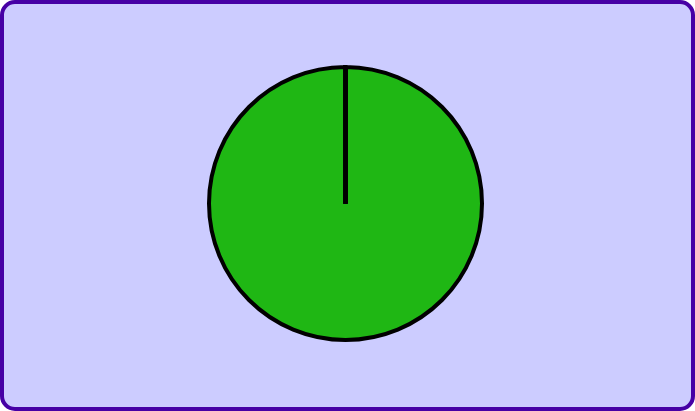
| Category | Series 0 |
|---|---|
| 0 | 1 |
| 1 | 0 |
| 2 | 0 |
| 3 | 0 |
| 4 | 0 |
| 5 | 0 |
| 6 | 0 |
| 7 | 0 |
| 8 | 0 |
| 9 | 0 |